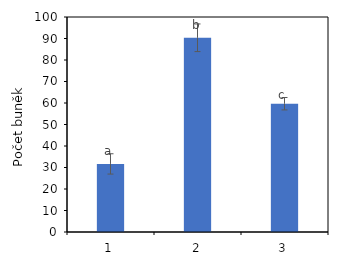
| Category | Series 0 |
|---|---|
| 0 | 31.667 |
| 1 | 90.333 |
| 2 | 59.667 |